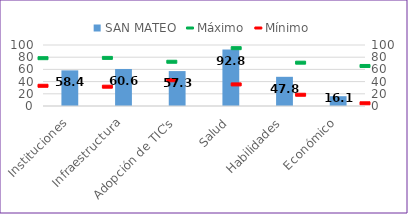
| Category | SAN MATEO |
|---|---|
| Instituciones | 58.403 |
| Infraestructura | 60.639 |
| Adopción de TIC's | 57.252 |
| Salud | 92.785 |
| Habilidades | 47.845 |
| Económico | 16.071 |